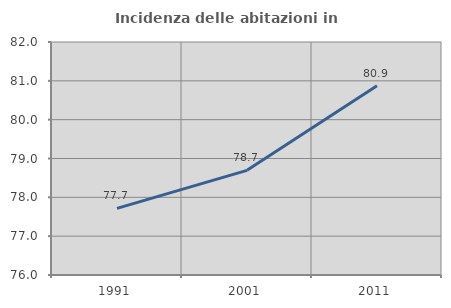
| Category | Incidenza delle abitazioni in proprietà  |
|---|---|
| 1991.0 | 77.716 |
| 2001.0 | 78.695 |
| 2011.0 | 80.872 |